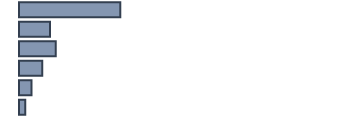
| Category | 36,2 |
|---|---|
| 0 | 30.6 |
| 1 | 9.4 |
| 2 | 11.1 |
| 3 | 7 |
| 4 | 3.8 |
| 5 | 1.9 |